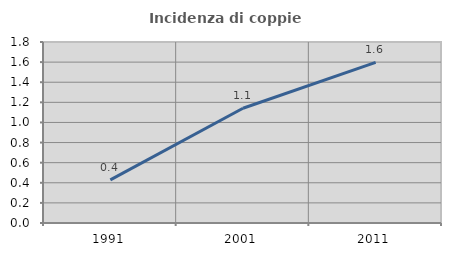
| Category | Incidenza di coppie miste |
|---|---|
| 1991.0 | 0.429 |
| 2001.0 | 1.142 |
| 2011.0 | 1.597 |